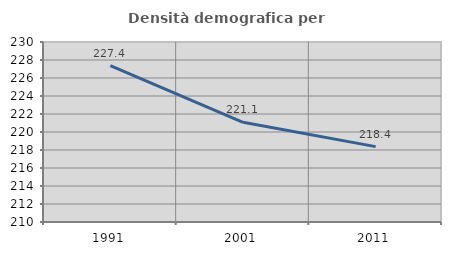
| Category | Densità demografica |
|---|---|
| 1991.0 | 227.384 |
| 2001.0 | 221.082 |
| 2011.0 | 218.376 |